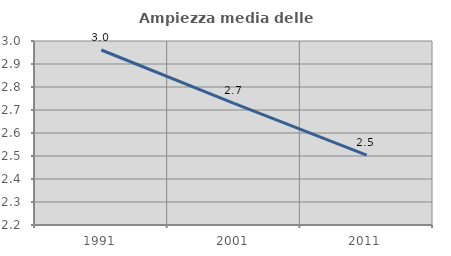
| Category | Ampiezza media delle famiglie |
|---|---|
| 1991.0 | 2.961 |
| 2001.0 | 2.729 |
| 2011.0 | 2.504 |